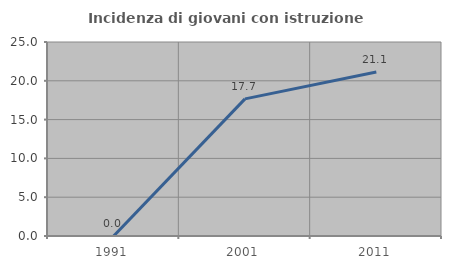
| Category | Incidenza di giovani con istruzione universitaria |
|---|---|
| 1991.0 | 0 |
| 2001.0 | 17.674 |
| 2011.0 | 21.127 |